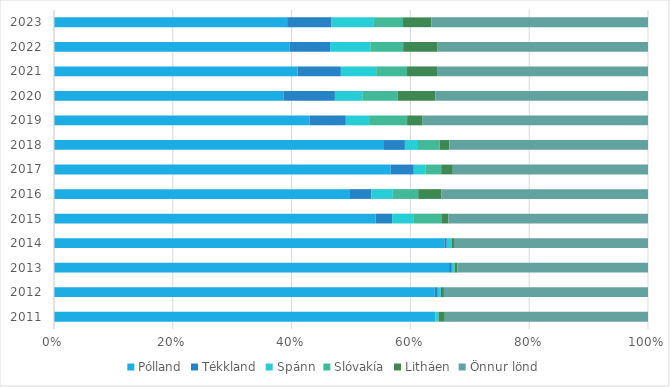
| Category | Pólland | Tékkland | Spánn | Slóvakía | Litháen | Önnur lönd |
|---|---|---|---|---|---|---|
| 2011.0 | 0.642 | 0 | 0.005 | 0 | 0.011 | 0.342 |
| 2012.0 | 0.641 | 0.005 | 0.005 | 0 | 0.005 | 0.344 |
| 2013.0 | 0.665 | 0.005 | 0.005 | 0 | 0.005 | 0.321 |
| 2014.0 | 0.657 | 0.004 | 0.008 | 0 | 0.004 | 0.327 |
| 2015.0 | 0.542 | 0.028 | 0.036 | 0.047 | 0.012 | 0.336 |
| 2016.0 | 0.498 | 0.036 | 0.036 | 0.043 | 0.039 | 0.348 |
| 2017.0 | 0.567 | 0.039 | 0.02 | 0.027 | 0.02 | 0.329 |
| 2018.0 | 0.556 | 0.035 | 0.022 | 0.036 | 0.017 | 0.334 |
| 2019.0 | 0.43 | 0.061 | 0.039 | 0.064 | 0.026 | 0.379 |
| 2020.0 | 0.386 | 0.087 | 0.046 | 0.06 | 0.064 | 0.358 |
| 2021.0 | 0.41 | 0.073 | 0.059 | 0.052 | 0.051 | 0.355 |
| 2022.0 | 0.397 | 0.068 | 0.068 | 0.055 | 0.058 | 0.354 |
| 2023.0 | 0.393 | 0.075 | 0.071 | 0.049 | 0.048 | 0.364 |